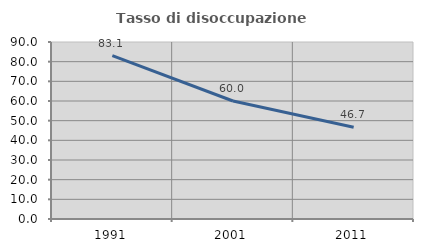
| Category | Tasso di disoccupazione giovanile  |
|---|---|
| 1991.0 | 83.058 |
| 2001.0 | 60 |
| 2011.0 | 46.667 |